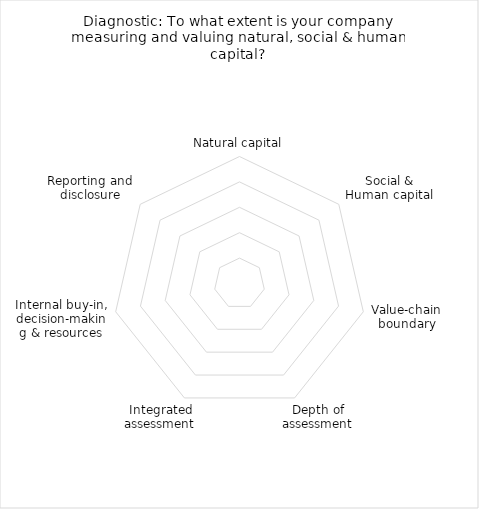
| Category | Series 0 |
|---|---|
| Natural capital | 0 |
| Social & Human capital | 0 |
| Value-chain boundary | 0 |
| Depth of assessment | 0 |
| Integrated assessment | 0 |
| Internal buy-in, decision-making & resources | 0 |
| Reporting and disclosure | 0 |